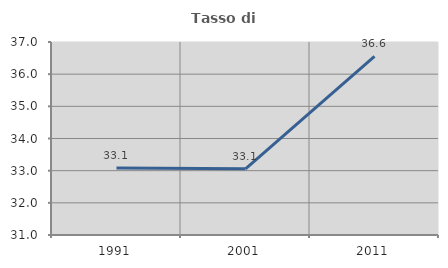
| Category | Tasso di occupazione   |
|---|---|
| 1991.0 | 33.086 |
| 2001.0 | 33.058 |
| 2011.0 | 36.551 |